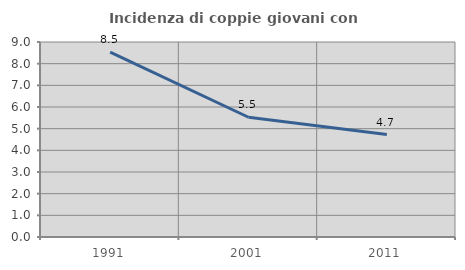
| Category | Incidenza di coppie giovani con figli |
|---|---|
| 1991.0 | 8.529 |
| 2001.0 | 5.527 |
| 2011.0 | 4.728 |